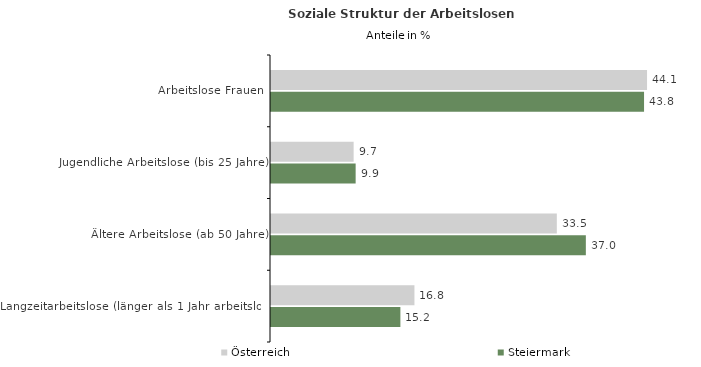
| Category | Österreich | Steiermark |
|---|---|---|
| Arbeitslose Frauen | 44.136 | 43.785 |
| Jugendliche Arbeitslose (bis 25 Jahre) | 9.698 | 9.935 |
| Ältere Arbeitslose (ab 50 Jahre) | 33.548 | 36.954 |
| Langzeitarbeitslose (länger als 1 Jahr arbeitslos) | 16.836 | 15.186 |